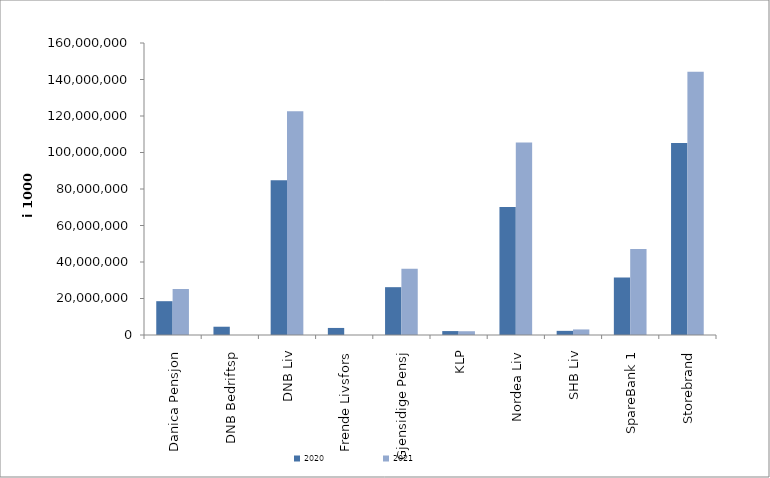
| Category | 2020 | 2021 |
|---|---|---|
| Danica Pensjon | 18526269.5 | 25191577.336 |
| DNB Bedriftsp | 4535748 | 0 |
| DNB Liv | 84790630.706 | 122659439.226 |
| Frende Livsfors | 3863942 | 0 |
| Gjensidige Pensj | 26206027 | 36333371 |
| KLP | 2151789.025 | 2073544.898 |
| Nordea Liv | 70145270 | 105547000 |
| SHB Liv | 2269628.506 | 3051253.714 |
| SpareBank 1 | 31469716.431 | 47144820.957 |
| Storebrand | 105148557.005 | 144290948.795 |